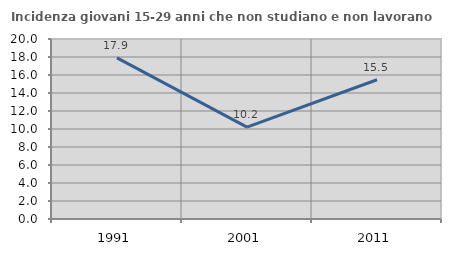
| Category | Incidenza giovani 15-29 anni che non studiano e non lavorano  |
|---|---|
| 1991.0 | 17.905 |
| 2001.0 | 10.204 |
| 2011.0 | 15.473 |